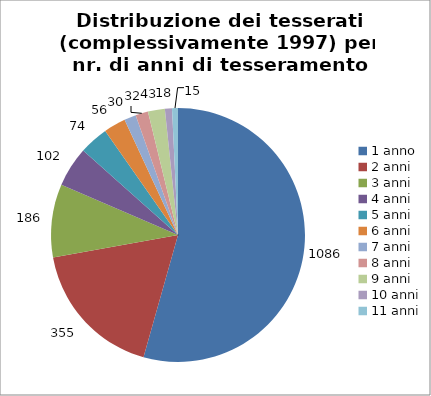
| Category | Nr. Tesserati |
|---|---|
| 1 anno | 1086 |
| 2 anni | 355 |
| 3 anni | 186 |
| 4 anni | 102 |
| 5 anni | 74 |
| 6 anni | 56 |
| 7 anni | 30 |
| 8 anni | 32 |
| 9 anni | 43 |
| 10 anni | 18 |
| 11 anni | 15 |